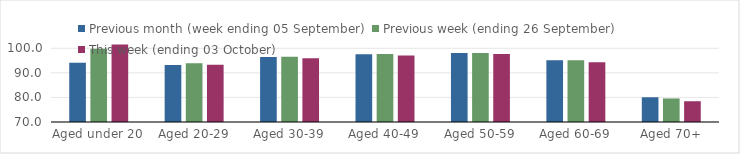
| Category | Previous month (week ending 05 September) | Previous week (ending 26 September) | This week (ending 03 October) |
|---|---|---|---|
| Aged under 20 | 94.09 | 99.77 | 101.59 |
| Aged 20-29 | 93.16 | 93.87 | 93.31 |
| Aged 30-39 | 96.44 | 96.56 | 95.95 |
| Aged 40-49 | 97.58 | 97.7 | 97.03 |
| Aged 50-59 | 98.05 | 98.04 | 97.66 |
| Aged 60-69 | 95.14 | 95.08 | 94.27 |
| Aged 70+ | 80.07 | 79.58 | 78.45 |